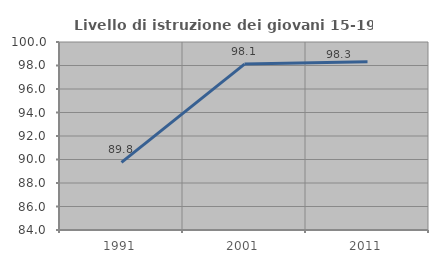
| Category | Livello di istruzione dei giovani 15-19 anni |
|---|---|
| 1991.0 | 89.762 |
| 2001.0 | 98.12 |
| 2011.0 | 98.312 |